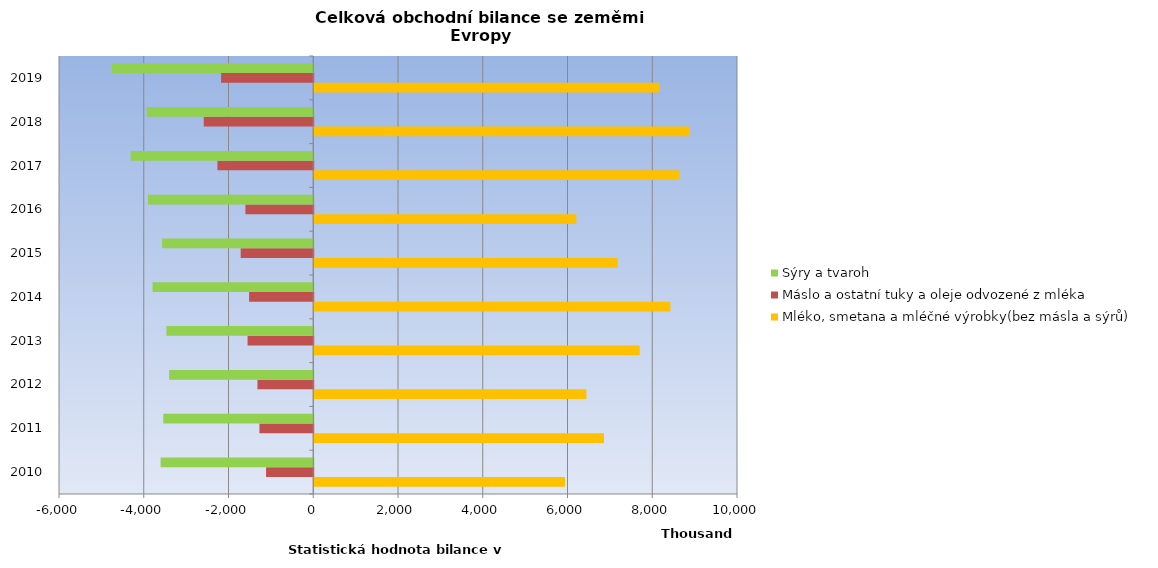
| Category | Mléko, smetana a mléčné výrobky(bez másla a sýrů)  | Máslo a ostatní tuky a oleje odvozené z mléka | Sýry a tvaroh |
|---|---|---|---|
| 2010 | 5916958 | -1112937 | -3602501 |
| 2011 | 6837514 | -1270671 | -3538300 |
| 2012 | 6422793 | -1316803 | -3402202 |
| 2013 | 7681735 | -1549969 | -3465110 |
| 2014 | 8404741 | -1514748 | -3791271 |
| 2015 | 7163847 | -1712754 | -3565416 |
| 2016 | 6185637 | -1600714 | -3900448 |
| 2017 | 8617286 | -2261182 | -4308303 |
| 2018 | 8867737 | -2583738 | -3931147 |
| 2019 | 8149343 | -2174974 | -4750979 |